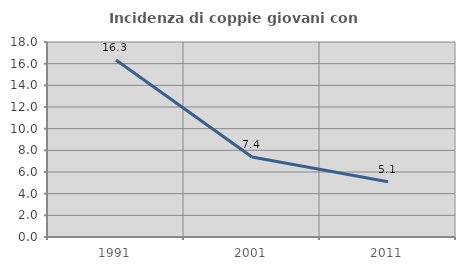
| Category | Incidenza di coppie giovani con figli |
|---|---|
| 1991.0 | 16.346 |
| 2001.0 | 7.391 |
| 2011.0 | 5.091 |